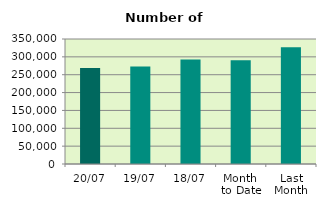
| Category | Series 0 |
|---|---|
| 20/07 | 268896 |
| 19/07 | 272814 |
| 18/07 | 292450 |
| Month 
to Date | 290459.429 |
| Last
Month | 326674.818 |